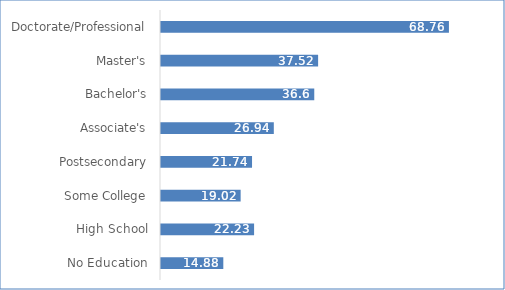
| Category | Series 0 |
|---|---|
| No Education | 14.88 |
| High School | 22.23 |
| Some College | 19.02 |
| Postsecondary | 21.74 |
| Associate's | 26.94 |
| Bachelor's | 36.6 |
| Master's | 37.52 |
| Doctorate/Professional | 68.76 |